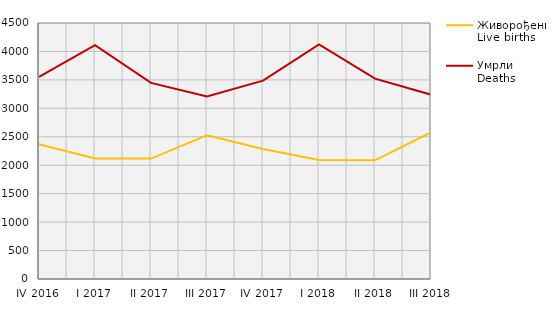
| Category | Живорођени
Live births | Умрли
Deaths |
|---|---|---|
| IV 2016 | 2369 | 3552 |
| I 2017 | 2118 | 4111 |
| II 2017 | 2116 | 3448 |
| III 2017 | 2528 | 3209 |
| IV 2017 | 2286 | 3486 |
| I 2018 | 2093 | 4123 |
| II 2018 | 2087 | 3522 |
| III 2018 | 2576 | 3241 |